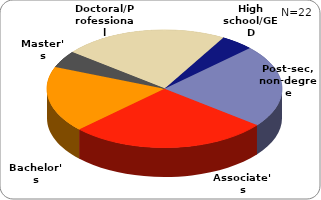
| Category | Series 0 |
|---|---|
| High school/GED | 0.045 |
| Post-sec, non-degree | 0.227 |
| Associate's | 0.273 |
| Bachelor's | 0.182 |
| Master's | 0.045 |
| Doctoral/Professional | 0.227 |